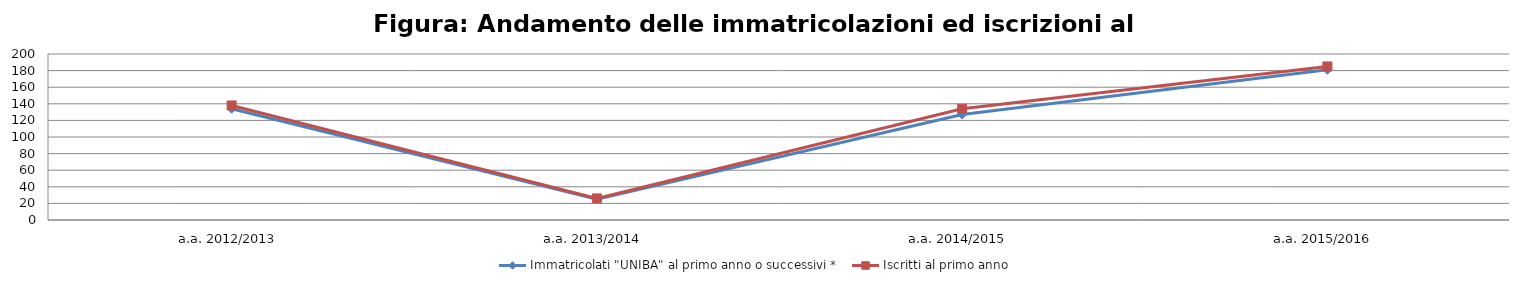
| Category | Immatricolati "UNIBA" al primo anno o successivi * | Iscritti al primo anno  |
|---|---|---|
| a.a. 2012/2013 | 134 | 138 |
| a.a. 2013/2014 | 25 | 26 |
| a.a. 2014/2015 | 127 | 134 |
| a.a. 2015/2016 | 181 | 185 |